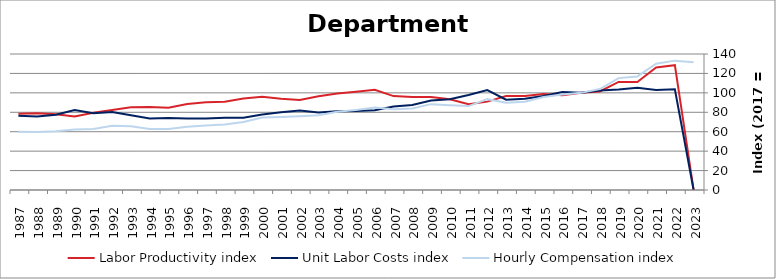
| Category | Labor Productivity index | Unit Labor Costs index | Hourly Compensation index |
|---|---|---|---|
| 2023.0 | 0 | 0 | 131.547 |
| 2022.0 | 128.526 | 103.612 | 133.168 |
| 2021.0 | 126.154 | 103.01 | 129.951 |
| 2020.0 | 111.187 | 105.136 | 116.898 |
| 2019.0 | 111.277 | 103.492 | 115.164 |
| 2018.0 | 101.402 | 102.528 | 103.965 |
| 2017.0 | 100 | 100 | 100 |
| 2016.0 | 97.455 | 100.896 | 98.328 |
| 2015.0 | 98.839 | 96.752 | 95.629 |
| 2014.0 | 96.721 | 93.946 | 90.865 |
| 2013.0 | 96.766 | 92.936 | 89.93 |
| 2012.0 | 90.979 | 102.8 | 93.526 |
| 2011.0 | 88.32 | 97.8 | 86.376 |
| 2010.0 | 93.323 | 93.449 | 87.21 |
| 2009.0 | 95.835 | 92.229 | 88.388 |
| 2008.0 | 95.843 | 87.605 | 83.963 |
| 2007.0 | 96.647 | 85.982 | 83.099 |
| 2006.0 | 103.183 | 82.181 | 84.797 |
| 2005.0 | 101.209 | 81.287 | 82.27 |
| 2004.0 | 99.365 | 80.991 | 80.477 |
| 2003.0 | 96.483 | 79.787 | 76.981 |
| 2002.0 | 92.715 | 81.803 | 75.844 |
| 2001.0 | 93.886 | 79.961 | 75.072 |
| 2000.0 | 95.929 | 77.726 | 74.562 |
| 1999.0 | 94.285 | 74.333 | 70.085 |
| 1998.0 | 90.75 | 74.41 | 67.527 |
| 1997.0 | 90.212 | 73.693 | 66.48 |
| 1996.0 | 88.613 | 73.566 | 65.189 |
| 1995.0 | 84.712 | 74.017 | 62.702 |
| 1994.0 | 85.358 | 73.669 | 62.882 |
| 1993.0 | 85.26 | 76.882 | 65.55 |
| 1992.0 | 82.413 | 80.33 | 66.202 |
| 1991.0 | 79.591 | 78.941 | 62.83 |
| 1990.0 | 75.665 | 82.265 | 62.246 |
| 1989.0 | 78.067 | 77.56 | 60.549 |
| 1988.0 | 78.938 | 75.655 | 59.721 |
| 1987.0 | 78.51 | 76.357 | 59.948 |